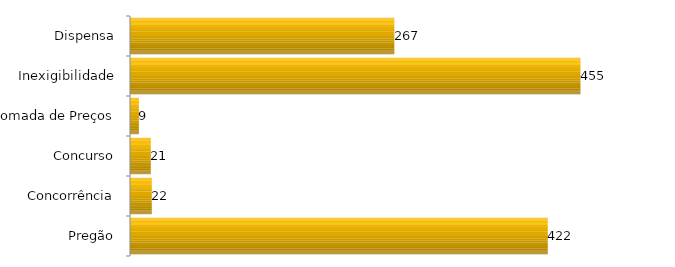
| Category | Total |
|---|---|
| Pregão | 422 |
| Concorrência | 22 |
| Concurso | 21 |
| Tomada de Preços | 9 |
| Inexigibilidade | 455 |
| Dispensa | 267 |